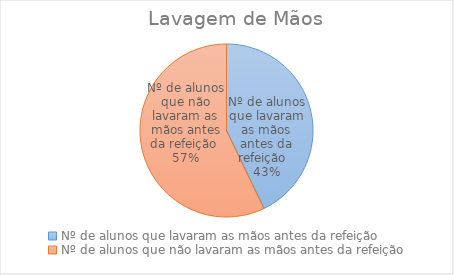
| Category | Series 5 |
|---|---|
| Nº de alunos que lavaram as mãos antes da refeição   | 36 |
| Nº de alunos que não lavaram as mãos antes da refeição  | 48 |